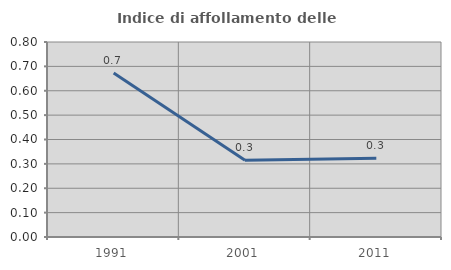
| Category | Indice di affollamento delle abitazioni  |
|---|---|
| 1991.0 | 0.673 |
| 2001.0 | 0.315 |
| 2011.0 | 0.323 |